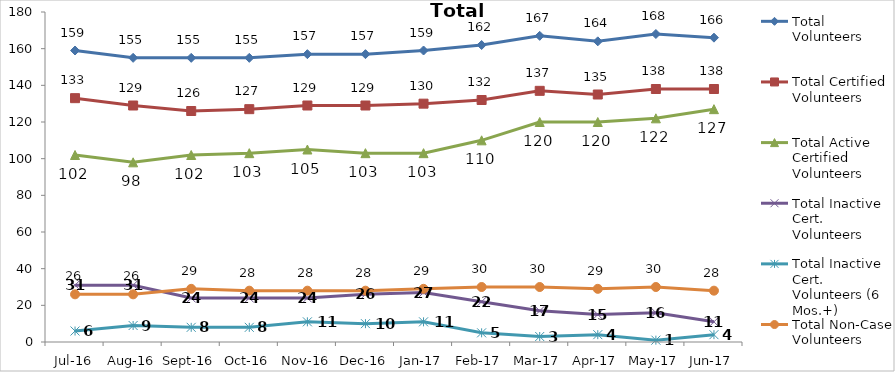
| Category | Total Volunteers | Total Certified Volunteers | Total Active Certified Volunteers | Total Inactive Cert. Volunteers | Total Inactive Cert. Volunteers (6 Mos.+) | Total Non-Case Volunteers |
|---|---|---|---|---|---|---|
| Jul-16 | 159 | 133 | 102 | 31 | 6 | 26 |
| Aug-16 | 155 | 129 | 98 | 31 | 9 | 26 |
| Sep-16 | 155 | 126 | 102 | 24 | 8 | 29 |
| Oct-16 | 155 | 127 | 103 | 24 | 8 | 28 |
| Nov-16 | 157 | 129 | 105 | 24 | 11 | 28 |
| Dec-16 | 157 | 129 | 103 | 26 | 10 | 28 |
| Jan-17 | 159 | 130 | 103 | 27 | 11 | 29 |
| Feb-17 | 162 | 132 | 110 | 22 | 5 | 30 |
| Mar-17 | 167 | 137 | 120 | 17 | 3 | 30 |
| Apr-17 | 164 | 135 | 120 | 15 | 4 | 29 |
| May-17 | 168 | 138 | 122 | 16 | 1 | 30 |
| Jun-17 | 166 | 138 | 127 | 11 | 4 | 28 |